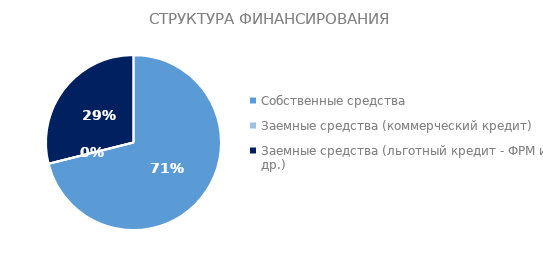
| Category | Series 0 |
|---|---|
| Собственные средства | 123000 |
| Заемные средства (коммерческий кредит) | 0 |
| Заемные средства (льготный кредит - ФРМ и др.) | 50000 |